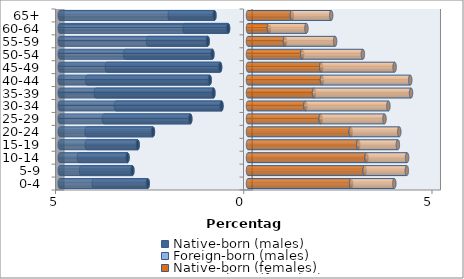
| Category | Native-born (males) | Foreign-born (males) | Native-born (females) | Foreign-born (females) |
|---|---|---|---|---|
| 0-4 | -2.664 | -1.431 | 2.738 | 1.148 |
| 5-9 | -3.072 | -1.359 | 3.098 | 1.12 |
| 10-14 | -3.201 | -1.288 | 3.148 | 1.078 |
| 15-19 | -2.932 | -1.348 | 2.928 | 1.053 |
| 20-24 | -2.525 | -1.761 | 2.727 | 1.291 |
| 25-29 | -1.533 | -2.294 | 1.93 | 1.695 |
| 30-34 | -0.705 | -2.803 | 1.525 | 2.204 |
| 35-39 | -0.919 | -3.122 | 1.753 | 2.578 |
| 40-44 | -1.018 | -3.253 | 1.963 | 2.345 |
| 45-49 | -0.741 | -3.008 | 1.945 | 1.949 |
| 50-54 | -0.947 | -2.315 | 1.439 | 1.612 |
| 55-59 | -1.071 | -1.583 | 0.982 | 1.332 |
| 60-64 | -0.53 | -1.152 | 0.556 | 0.996 |
| 65+ | -0.892 | -1.186 | 1.166 | 1.043 |